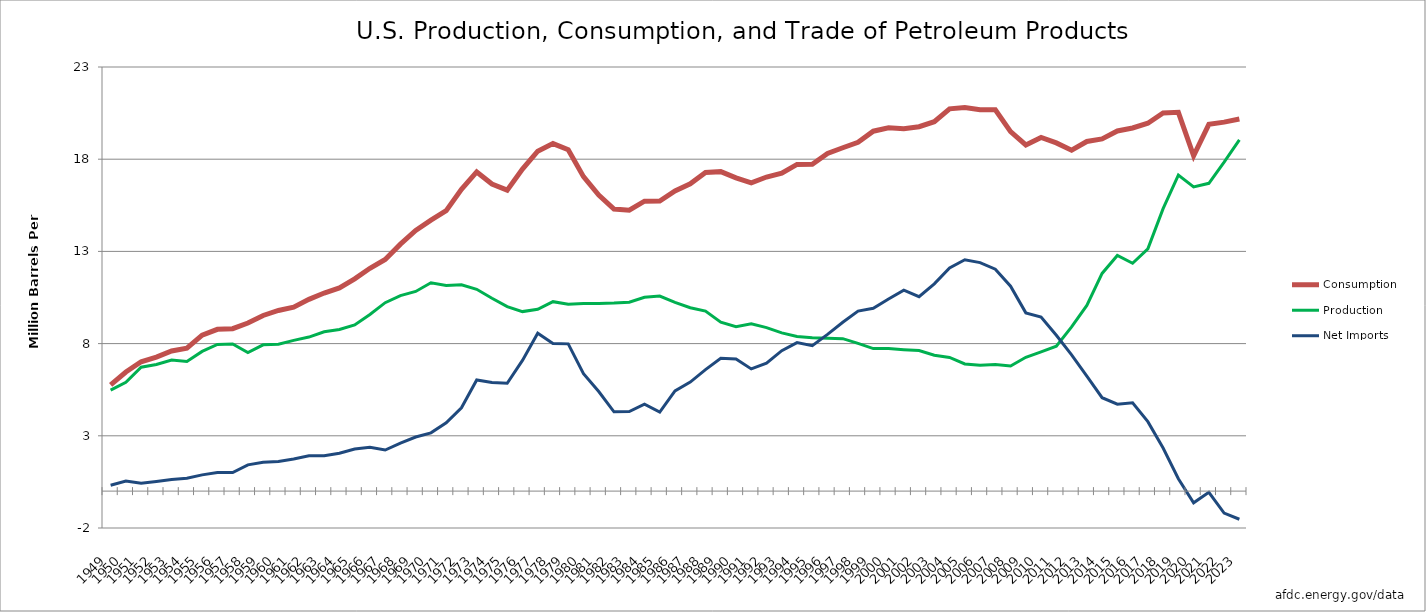
| Category | Consumption | Production | Net Imports |
|---|---|---|---|
| 1949.0 | 5.763 | 5.477 | 0.318 |
| 1950.0 | 6.458 | 5.906 | 0.545 |
| 1951.0 | 7.016 | 6.719 | 0.422 |
| 1952.0 | 7.27 | 6.867 | 0.52 |
| 1953.0 | 7.6 | 7.111 | 0.633 |
| 1954.0 | 7.756 | 7.033 | 0.696 |
| 1955.0 | 8.455 | 7.578 | 0.88 |
| 1956.0 | 8.775 | 7.951 | 1.006 |
| 1957.0 | 8.809 | 7.978 | 1.007 |
| 1958.0 | 9.118 | 7.517 | 1.425 |
| 1959.0 | 9.527 | 7.932 | 1.569 |
| 1960.0 | 9.797 | 7.965 | 1.613 |
| 1961.0 | 9.976 | 8.174 | 1.743 |
| 1962.0 | 10.4 | 8.353 | 1.913 |
| 1963.0 | 10.743 | 8.64 | 1.915 |
| 1964.0 | 11.023 | 8.769 | 2.057 |
| 1965.0 | 11.512 | 9.014 | 2.281 |
| 1966.0 | 12.084 | 9.579 | 2.375 |
| 1967.0 | 12.56 | 10.22 | 2.23 |
| 1968.0 | 13.393 | 10.599 | 2.609 |
| 1969.0 | 14.137 | 10.827 | 2.933 |
| 1970.0 | 14.697 | 11.297 | 3.161 |
| 1971.0 | 15.212 | 11.155 | 3.701 |
| 1972.0 | 16.367 | 11.185 | 4.519 |
| 1973.0 | 17.308 | 10.946 | 6.025 |
| 1974.0 | 16.653 | 10.462 | 5.892 |
| 1975.0 | 16.322 | 10.007 | 5.846 |
| 1976.0 | 17.461 | 9.736 | 7.09 |
| 1977.0 | 18.431 | 9.862 | 8.565 |
| 1978.0 | 18.847 | 10.275 | 8.002 |
| 1979.0 | 18.513 | 10.135 | 7.985 |
| 1980.0 | 17.056 | 10.17 | 6.365 |
| 1981.0 | 16.058 | 10.18 | 5.401 |
| 1982.0 | 15.296 | 10.199 | 4.298 |
| 1983.0 | 15.231 | 10.246 | 4.312 |
| 1984.0 | 15.726 | 10.509 | 4.715 |
| 1985.0 | 15.726 | 10.581 | 4.286 |
| 1986.0 | 16.281 | 10.231 | 5.439 |
| 1987.0 | 16.665 | 9.944 | 5.914 |
| 1988.0 | 17.283 | 9.765 | 6.587 |
| 1989.0 | 17.325 | 9.159 | 7.202 |
| 1990.0 | 16.988 | 8.914 | 7.161 |
| 1991.0 | 16.714 | 9.076 | 6.626 |
| 1992.0 | 17.033 | 8.868 | 6.938 |
| 1993.0 | 17.237 | 8.582 | 7.618 |
| 1994.0 | 17.718 | 8.388 | 8.054 |
| 1995.0 | 17.725 | 8.322 | 7.886 |
| 1996.0 | 18.309 | 8.295 | 8.498 |
| 1997.0 | 18.62 | 8.269 | 9.158 |
| 1998.0 | 18.917 | 8.011 | 9.764 |
| 1999.0 | 19.519 | 7.731 | 9.912 |
| 2000.0 | 19.701 | 7.733 | 10.419 |
| 2001.0 | 19.649 | 7.67 | 10.9 |
| 2002.0 | 19.761 | 7.624 | 10.546 |
| 2003.0 | 20.034 | 7.369 | 11.238 |
| 2004.0 | 20.731 | 7.25 | 12.097 |
| 2005.0 | 20.802 | 6.898 | 12.549 |
| 2006.0 | 20.687 | 6.827 | 12.39 |
| 2007.0 | 20.68 | 6.86 | 12.036 |
| 2008.0 | 19.498 | 6.783 | 11.114 |
| 2009.0 | 18.771 | 7.26 | 9.667 |
| 2010.0 | 19.18 | 7.556 | 9.441 |
| 2011.0 | 18.882 | 7.861 | 8.45 |
| 2012.0 | 18.49 | 8.905 | 7.393 |
| 2013.0 | 18.961 | 10.071 | 6.237 |
| 2014.0 | 19.1 | 11.805 | 5.065 |
| 2015.0 | 19.532 | 12.782 | 4.711 |
| 2016.0 | 19.692 | 12.356 | 4.795 |
| 2017.0 | 19.952 | 13.14 | 3.768 |
| 2018.0 | 20.512 | 15.321 | 2.34 |
| 2019.0 | 20.543 | 17.136 | 0.67 |
| 2020.0 | 18.186 | 16.493 | -0.635 |
| 2021.0 | 19.89 | 16.693 | -0.062 |
| 2022.0 | 20.01 | 17.844 | -1.191 |
| 2023.0 | 20.181 | 19.051 | -1.525 |